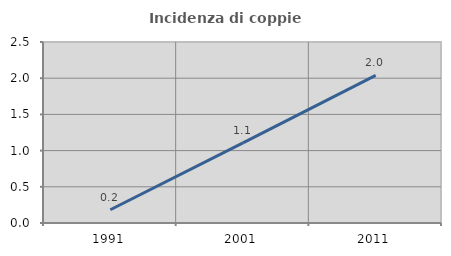
| Category | Incidenza di coppie miste |
|---|---|
| 1991.0 | 0.183 |
| 2001.0 | 1.107 |
| 2011.0 | 2.039 |